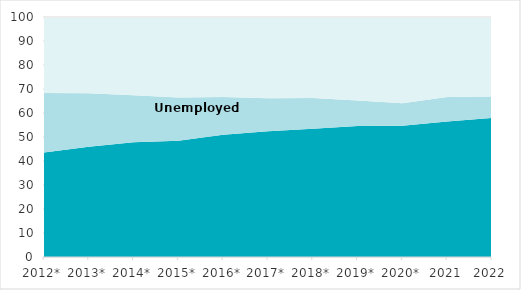
| Category | Employed | Unemployed | Population outside the labour force |
|---|---|---|---|
| 2012* | 43.52 | 24.796 | 42.131 |
| 2013* | 45.977 | 22.29 | 40.835 |
| 2014* | 47.838 | 19.604 | 40.497 |
| 2015* | 48.452 | 17.994 | 40.916 |
| 2016* | 50.965 | 15.651 | 39.578 |
| 2017* | 52.37 | 13.792 | 39.252 |
| 2018* | 53.461 | 12.829 | 38.671 |
| 2019* | 54.632 | 10.588 | 38.898 |
| 2020* | 54.66 | 9.363 | 39.693 |
| 2021 | 56.467 | 10.16 | 37.147 |
| 2022 | 57.9 | 9 | 36.4 |